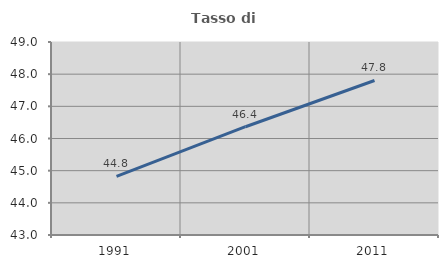
| Category | Tasso di occupazione   |
|---|---|
| 1991.0 | 44.823 |
| 2001.0 | 46.366 |
| 2011.0 | 47.803 |